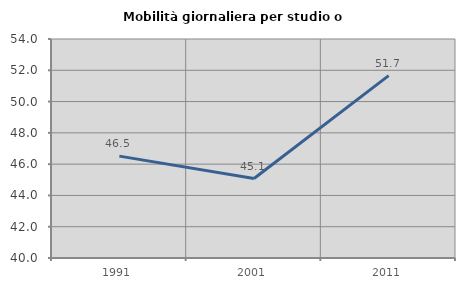
| Category | Mobilità giornaliera per studio o lavoro |
|---|---|
| 1991.0 | 46.512 |
| 2001.0 | 45.078 |
| 2011.0 | 51.657 |